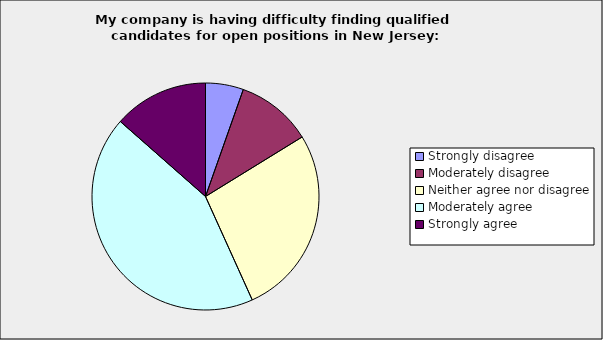
| Category | Series 0 |
|---|---|
| Strongly disagree | 0.054 |
| Moderately disagree | 0.108 |
| Neither agree nor disagree | 0.27 |
| Moderately agree | 0.432 |
| Strongly agree | 0.135 |